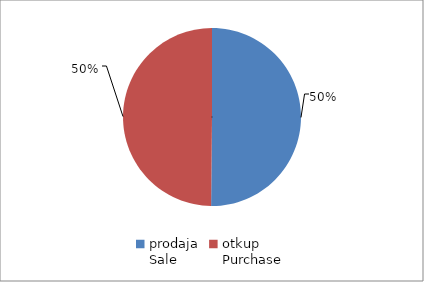
| Category | Series 0 |
|---|---|
| prodaja
Sale | 10961740.25 |
| otkup
Purchase | 10890834.21 |